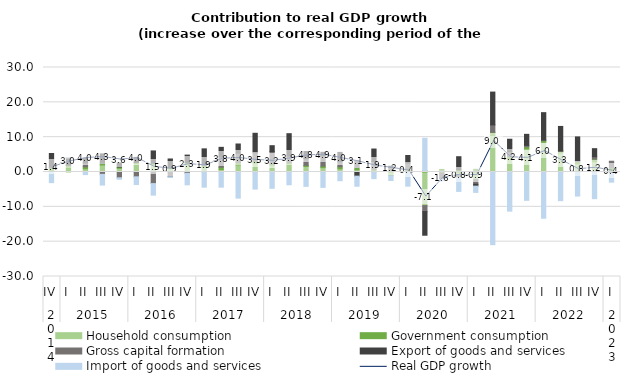
| Category | Household consumption | Government consumption | Gross capital formation | Export of goods and services | Import of goods and services |
|---|---|---|---|---|---|
| 0 | 0.496 | 0.637 | 0.237 | 3.945 | -3.049 |
| 1 | 1.358 | 0.593 | 0.023 | 2.081 | 0.02 |
| 2 | 0.934 | 0.546 | 1.114 | 1.378 | -0.747 |
| 3 | 2.009 | 0.5 | -0.668 | 2.7 | -3.081 |
| 4 | 1.074 | 0.363 | -1.672 | 1.167 | -0.418 |
| 5 | 2.415 | 0.323 | -1.383 | 1.457 | -2.215 |
| 6 | 2.209 | 0.31 | -3.325 | 3.528 | -3.317 |
| 7 | 0.947 | 0.373 | -1.386 | 2.419 | -0.189 |
| 8 | 2.204 | 0.537 | -0.371 | 2.109 | -3.313 |
| 9 | 1.284 | 0.592 | 0.29 | 4.479 | -4.353 |
| 10 | 0.69 | 0.679 | 2.957 | 2.753 | -4.358 |
| 11 | 2.058 | 0.654 | 2.686 | 2.644 | -7.507 |
| 12 | 2.574 | 0.538 | 2.384 | 5.614 | -4.907 |
| 13 | 1.904 | 0.429 | 3.535 | 1.685 | -4.675 |
| 14 | 2.345 | 0.331 | 1.915 | 6.41 | -3.664 |
| 15 | 1.568 | 0.331 | 1.945 | 2.033 | -4.13 |
| 16 | 1.25 | 0.427 | 3.022 | 0.959 | -4.412 |
| 17 | 0.907 | 0.584 | 1.475 | 2.658 | -2.512 |
| 18 | 0.618 | 0.661 | 2.018 | -1.189 | -2.896 |
| 19 | 0.172 | 0.631 | 2.214 | 3.578 | -1.909 |
| 20 | -1.103 | 0.59 | 0.737 | 0.315 | -1.335 |
| 21 | 0.392 | 0.47 | 1.71 | 2.161 | -4.063 |
| 22 | -9.648 | 0.413 | -1.723 | -6.783 | 9.273 |
| 23 | -0.266 | 0.569 | -1.526 | -0.244 | -0.528 |
| 24 | -1.087 | 0.625 | -0.457 | 3.765 | -4.03 |
| 25 | -2.185 | 0.775 | -1.327 | -0.556 | -1.791 |
| 26 | 10.473 | 0.92 | 2.118 | 9.432 | -20.866 |
| 27 | 3.765 | 0.725 | 1.338 | 3.576 | -11.235 |
| 28 | 6.641 | 0.593 | 0.412 | 3.167 | -8.135 |
| 29 | 8.537 | 0.454 | 0.202 | 7.843 | -13.279 |
| 30 | 5.462 | 0.489 | 0.121 | 7.008 | -8.228 |
| 31 | 2.325 | 0.607 | 0.289 | 6.852 | -6.903 |
| 32 | 2.919 | 0.797 | 0.662 | 2.319 | -7.657 |
| 33 | 0.31 | 0.934 | 1.847 | -0.332 | -2.583 |